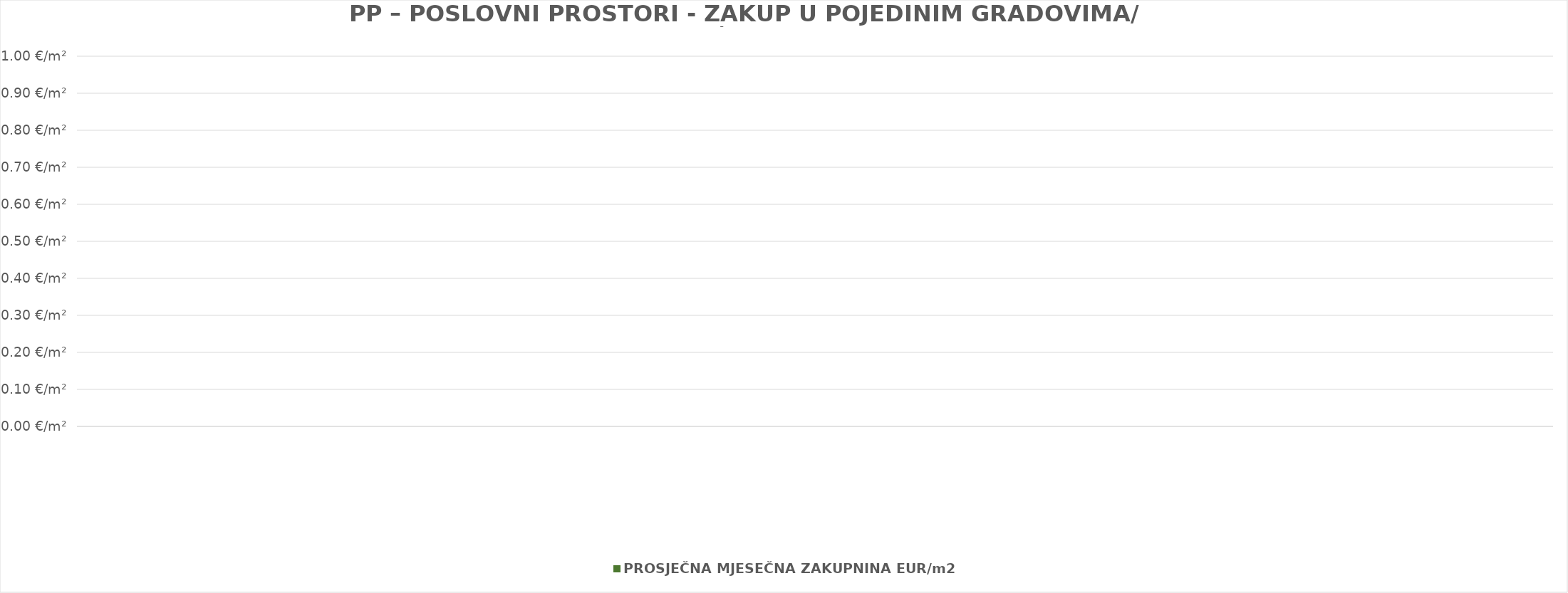
| Category | PROSJEČNA MJESEČNA ZAKUPNINA EUR/m2 |
|---|---|
| 0 | 0 |
| 1 | 0 |